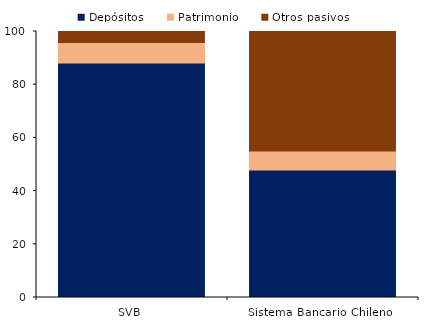
| Category | Depósitos | Patrimonio | Otros pasivos |
|---|---|---|---|
| SVB | 88.196 | 7.696 | 4.108 |
| Sistema Bancario Chileno | 47.944 | 7.143 | 44.913 |